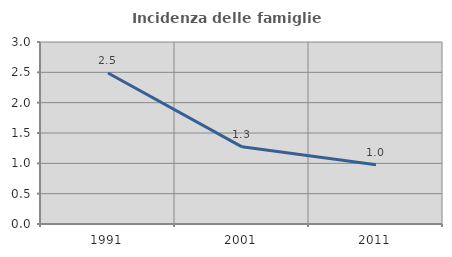
| Category | Incidenza delle famiglie numerose |
|---|---|
| 1991.0 | 2.489 |
| 2001.0 | 1.272 |
| 2011.0 | 0.978 |